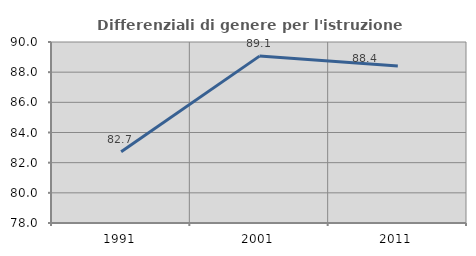
| Category | Differenziali di genere per l'istruzione superiore |
|---|---|
| 1991.0 | 82.724 |
| 2001.0 | 89.064 |
| 2011.0 | 88.412 |